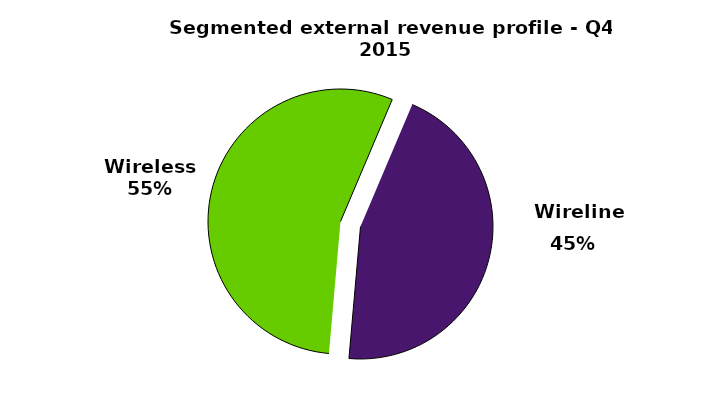
| Category | Series 0 |
|---|---|
| Revenues (%) | 0.55 |
| Wireless | 0.45 |